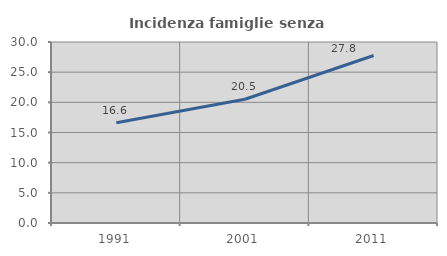
| Category | Incidenza famiglie senza nuclei |
|---|---|
| 1991.0 | 16.628 |
| 2001.0 | 20.504 |
| 2011.0 | 27.756 |